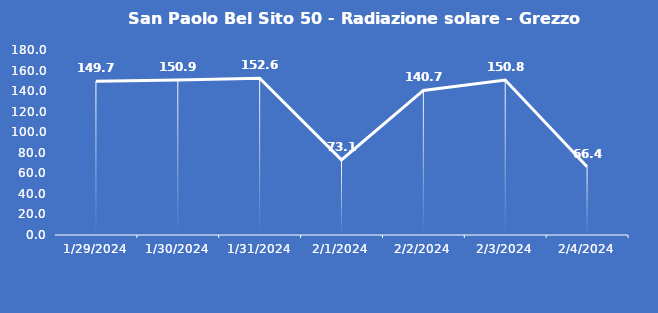
| Category | San Paolo Bel Sito 50 - Radiazione solare - Grezzo (W/m2) |
|---|---|
| 1/29/24 | 149.7 |
| 1/30/24 | 150.9 |
| 1/31/24 | 152.6 |
| 2/1/24 | 73.1 |
| 2/2/24 | 140.7 |
| 2/3/24 | 150.8 |
| 2/4/24 | 66.4 |